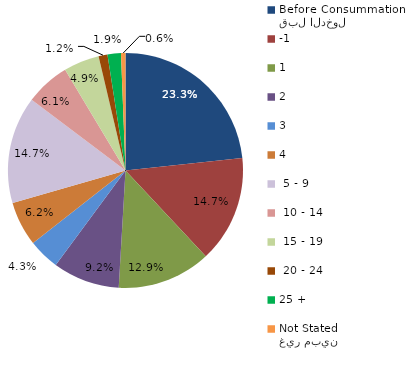
| Category | Series 0 |
|---|---|
| قبل الدخول
Before Consummation | 23.313 |
| -1 | 14.724 |
| 1 | 12.883 |
| 2 | 9.202 |
| 3 | 4.294 |
| 4 | 6.135 |
|  5 - 9 | 14.724 |
|  10 - 14 | 6.135 |
|  15 - 19 | 4.908 |
|  20 - 24 | 1.227 |
| 25 + | 1.84 |
| غير مبين
Not Stated | 0.613 |